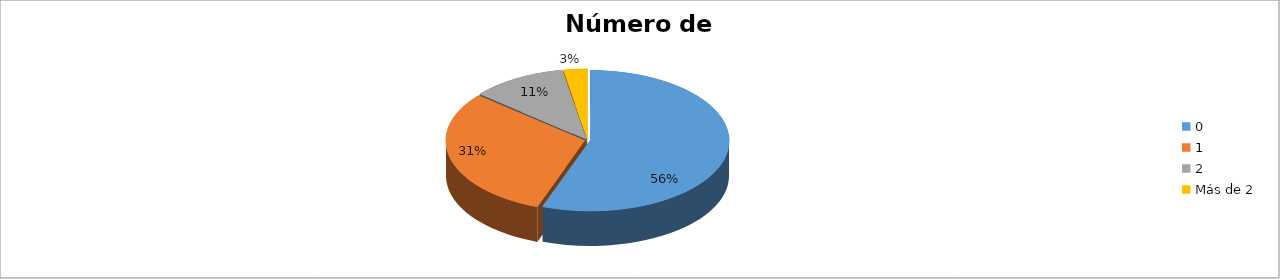
| Category | Series 0 |
|---|---|
| 0 | 0.556 |
| 1 | 0.306 |
| 2 | 0.111 |
| Más de 2 | 0.028 |